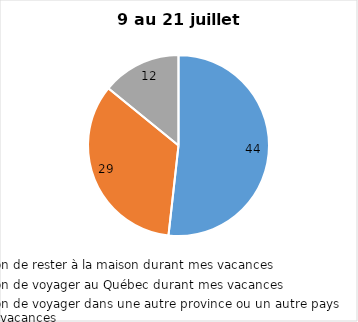
| Category | Series 0 |
|---|---|
| J’ai l’intention de rester à la maison durant mes vacances | 44 |
| J’ai l’intention de voyager au Québec durant mes vacances | 29 |
| J’ai l’intention de voyager dans une autre province ou un autre pays durant mes vacances | 12 |